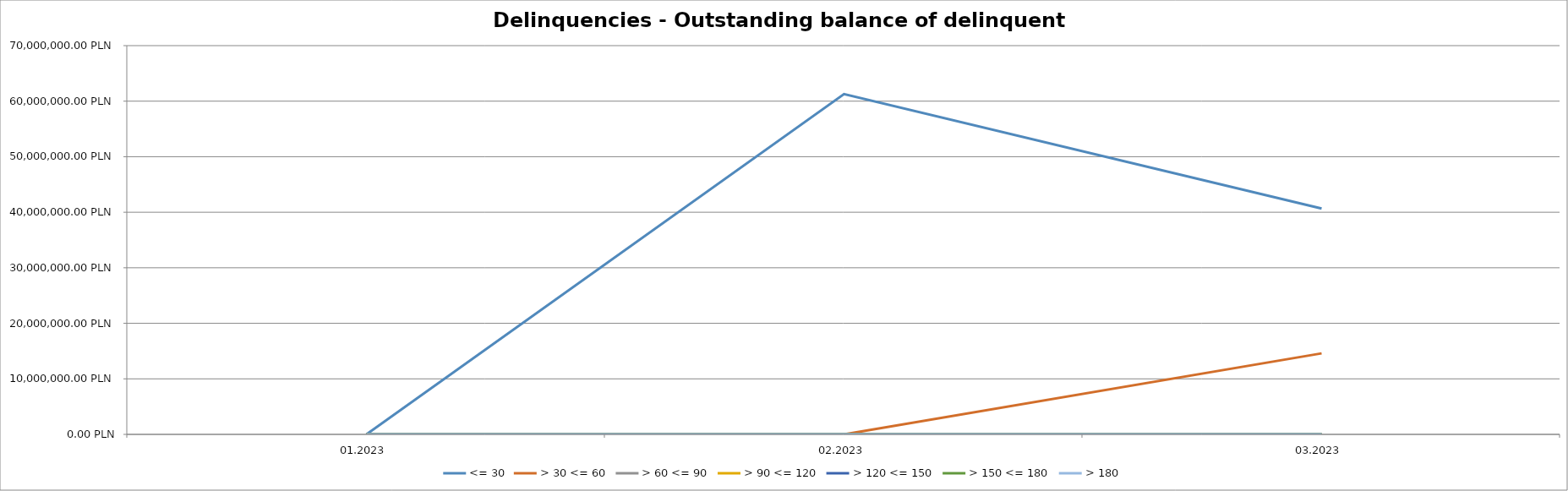
| Category | <= 30 | > 30 <= 60 | > 60 <= 90 | > 90 <= 120 | > 120 <= 150 | > 150 <= 180 | > 180 |
|---|---|---|---|---|---|---|---|
| 01.2023 | 0 | 0 | 0 | 0 | 0 | 0 | 0 |
| 02.2023 | 61279332.52 | 0 | 0 | 0 | 0 | 0 | 0 |
| 03.2023 | 40663789.15 | 14592814.21 | 0 | 0 | 0 | 0 | 0 |